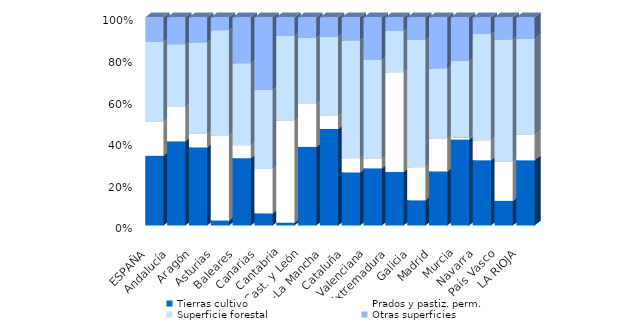
| Category | Tierras cultivo | Prados y pastiz. perm. | Superficie forestal | Otras superficies |
|---|---|---|---|---|
| ESPAÑA | 33.459 | 16.472 | 38.31 | 11.758 |
| Andalucía | 40.417 | 16.506 | 30.135 | 12.942 |
| Aragón | 37.495 | 6.521 | 43.882 | 12.103 |
| Asturias | 2.382 | 40.883 | 50.518 | 6.217 |
| Baleares | 32.335 | 6.247 | 39.272 | 22.146 |
| Canarias | 5.799 | 21.346 | 38.021 | 34.834 |
| Cantabria | 1.316 | 49.084 | 40.704 | 8.897 |
| Cast. y León | 37.716 | 20.653 | 31.706 | 9.925 |
| C.-La Mancha | 46.329 | 6.516 | 37.816 | 9.339 |
| Cataluña | 25.48 | 6.853 | 56.549 | 11.118 |
| C. Valenciana | 27.432 | 4.74 | 47.372 | 20.456 |
| Extremadura | 25.682 | 47.87 | 19.844 | 6.604 |
| Galicia | 12.099 | 15.851 | 61.195 | 10.854 |
| Madrid | 25.975 | 15.784 | 33.591 | 24.65 |
| Murcia | 41.276 | 1.068 | 36.689 | 20.967 |
| Navarra | 31.318 | 9.577 | 51.019 | 8.086 |
| País Vasco | 11.797 | 18.857 | 58.657 | 10.689 |
| LA RIOJA | 31.315 | 12.205 | 46.16 | 10.32 |